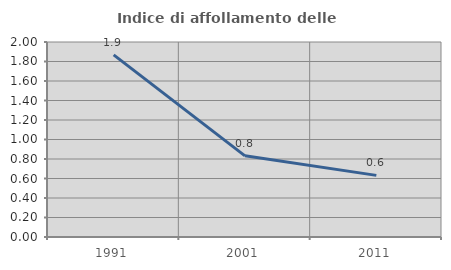
| Category | Indice di affollamento delle abitazioni  |
|---|---|
| 1991.0 | 1.868 |
| 2001.0 | 0.832 |
| 2011.0 | 0.632 |